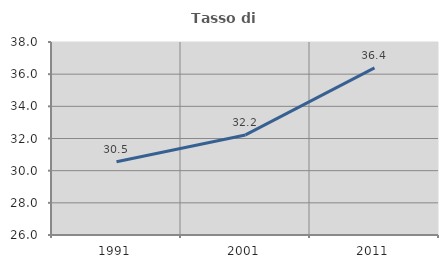
| Category | Tasso di occupazione   |
|---|---|
| 1991.0 | 30.55 |
| 2001.0 | 32.222 |
| 2011.0 | 36.387 |